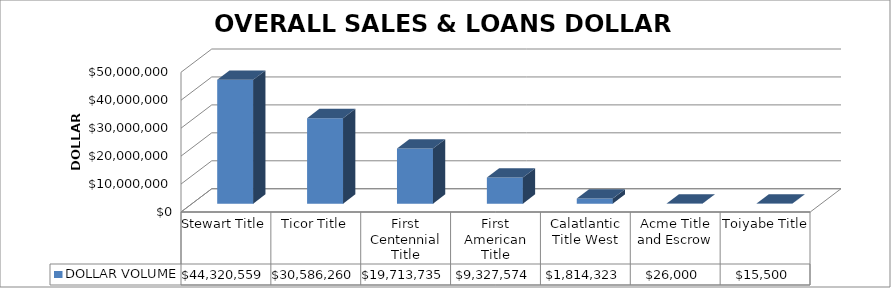
| Category | DOLLAR VOLUME |
|---|---|
| Stewart Title | 44320559.17 |
| Ticor Title | 30586260 |
| First Centennial Title | 19713735 |
| First American Title | 9327574 |
| Calatlantic Title West | 1814323 |
| Acme Title and Escrow | 26000 |
| Toiyabe Title | 15500 |